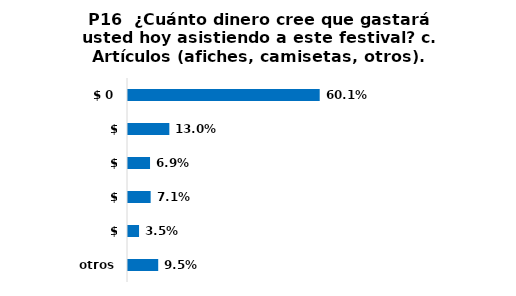
| Category | Series 0 |
|---|---|
| $ 0 | 0.601 |
| $ 10.000 | 0.13 |
| $ 20.000 | 0.069 |
| $ 30.000 | 0.071 |
| $ 50.000 | 0.035 |
| otros | 0.095 |